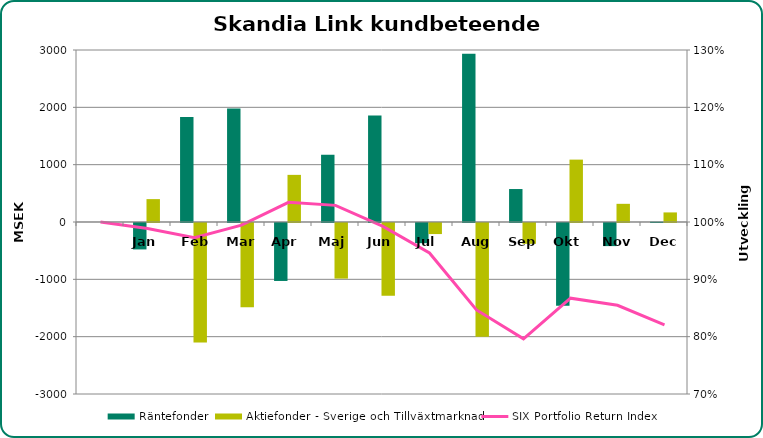
| Category | Räntefonder | Aktiefonder - Sverige och Tillväxtmarknad |
|---|---|---|
|  | 0 | 0 |
| Jan | -461 | 399 |
| Feb | 1831 | -2085 |
| Mar | 1981 | -1468 |
| Apr | -1011 | 822 |
| Maj | 1175 | -970 |
| Jun | 1859 | -1269 |
| Jul | -352 | -193 |
| Aug | 2934 | -1983 |
| Sep | 575 | -363 |
| Okt | -1444 | 1088 |
| Nov | -403 | 317 |
| Dec | 5 | 167 |